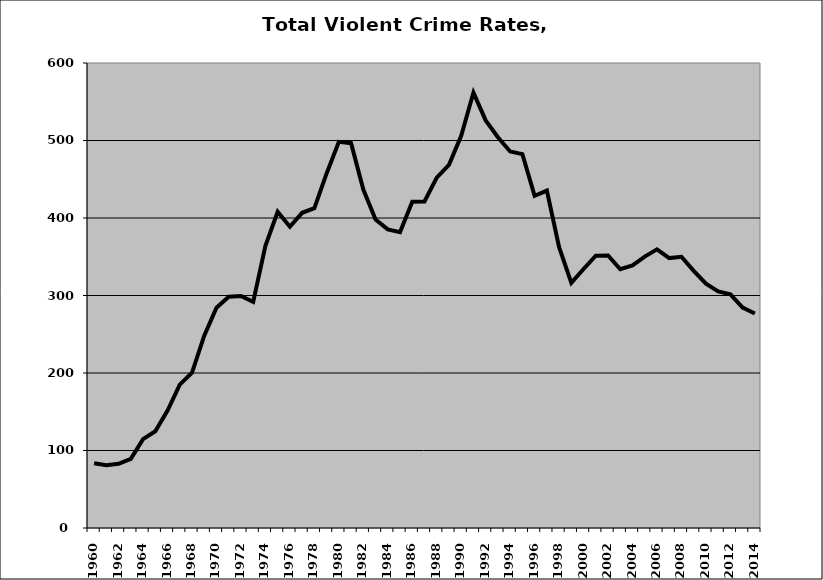
| Category | VCR |
|---|---|
| 1960.0 | 83.656 |
| 1961.0 | 80.863 |
| 1962.0 | 82.856 |
| 1963.0 | 89.315 |
| 1964.0 | 114.673 |
| 1965.0 | 124.822 |
| 1966.0 | 151.635 |
| 1967.0 | 184.968 |
| 1968.0 | 200.434 |
| 1969.0 | 248.119 |
| 1970.0 | 284.256 |
| 1971.0 | 298.376 |
| 1972.0 | 299.416 |
| 1973.0 | 291.716 |
| 1974.0 | 364.105 |
| 1975.0 | 408.04 |
| 1976.0 | 388.709 |
| 1977.0 | 406.7 |
| 1978.0 | 412.662 |
| 1979.0 | 457.478 |
| 1980.0 | 498.254 |
| 1981.0 | 496.557 |
| 1982.0 | 436.716 |
| 1983.0 | 397.906 |
| 1984.0 | 385.324 |
| 1985.0 | 381.608 |
| 1986.0 | 420.945 |
| 1987.0 | 421.328 |
| 1988.0 | 452.024 |
| 1989.0 | 468.589 |
| 1990.0 | 506.162 |
| 1991.0 | 561.843 |
| 1992.0 | 525.917 |
| 1993.0 | 504.148 |
| 1994.0 | 485.768 |
| 1995.0 | 482.459 |
| 1996.0 | 428.676 |
| 1997.0 | 435.419 |
| 1998.0 | 362.459 |
| 1999.0 | 316.4 |
| 2000.0 | 334.137 |
| 2001.0 | 351.394 |
| 2002.0 | 351.732 |
| 2003.0 | 333.853 |
| 2004.0 | 338.747 |
| 2005.0 | 350.127 |
| 2006.0 | 359.583 |
| 2007.0 | 348.306 |
| 2008.0 | 349.946 |
| 2009.0 | 331.856 |
| 2010.0 | 315.225 |
| 2011.0 | 305.155 |
| 2012.0 | 301.453 |
| 2013.0 | 284.523 |
| 2014.0 | 276.734 |